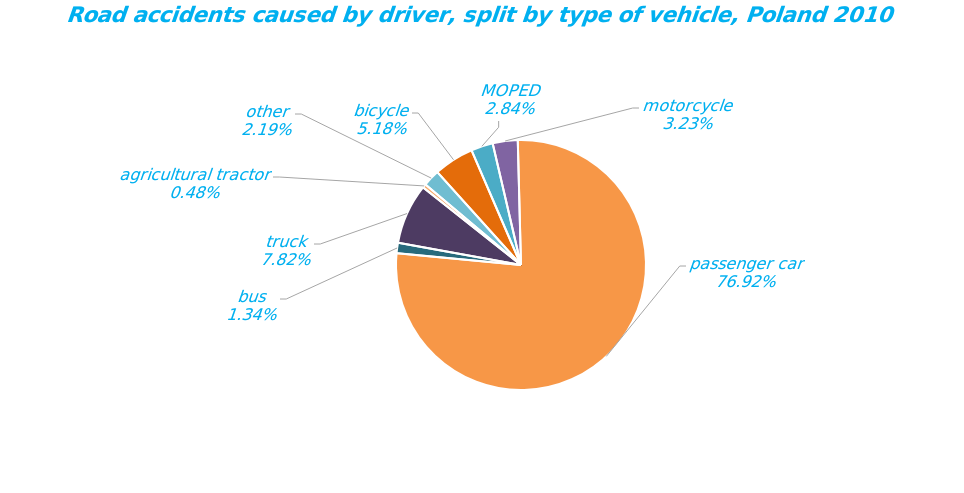
| Category | Series 0 |
|---|---|
| bicycle | 1588 |
| MOPED | 869 |
| motorcycle | 990 |
| passenger car | 23559 |
| bus | 410 |
| truck | 2394 |
| agricultural tractor | 146 |
| other | 672 |